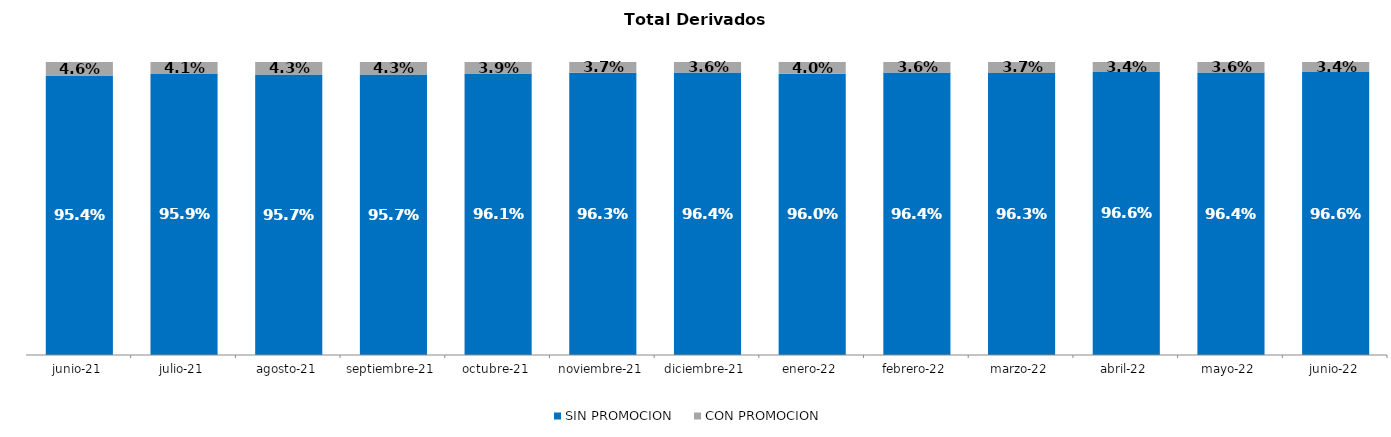
| Category | SIN PROMOCION   | CON PROMOCION   |
|---|---|---|
| 2021-06-01 | 0.954 | 0.046 |
| 2021-07-01 | 0.959 | 0.041 |
| 2021-08-01 | 0.957 | 0.043 |
| 2021-09-01 | 0.957 | 0.043 |
| 2021-10-01 | 0.961 | 0.039 |
| 2021-11-01 | 0.963 | 0.037 |
| 2021-12-01 | 0.964 | 0.036 |
| 2022-01-01 | 0.96 | 0.04 |
| 2022-02-01 | 0.964 | 0.036 |
| 2022-03-01 | 0.963 | 0.037 |
| 2022-04-01 | 0.966 | 0.034 |
| 2022-05-01 | 0.964 | 0.036 |
| 2022-06-01 | 0.966 | 0.034 |